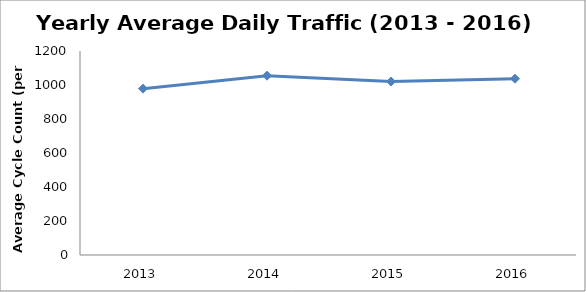
| Category | Series 0 |
|---|---|
| 2013.0 | 978.545 |
| 2014.0 | 1054.797 |
| 2015.0 | 1020.367 |
| 2016.0 | 1036.915 |